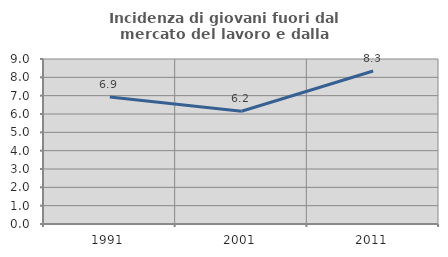
| Category | Incidenza di giovani fuori dal mercato del lavoro e dalla formazione  |
|---|---|
| 1991.0 | 6.931 |
| 2001.0 | 6.152 |
| 2011.0 | 8.348 |